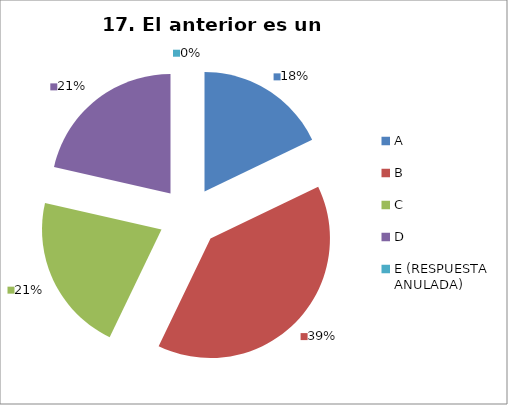
| Category | CANTIDAD DE RESPUESTAS PREGUNTA (17) | PORCENTAJE |
|---|---|---|
| A | 5 | 0.179 |
| B | 11 | 0.393 |
| C | 6 | 0.214 |
| D | 6 | 0.214 |
| E (RESPUESTA ANULADA) | 0 | 0 |